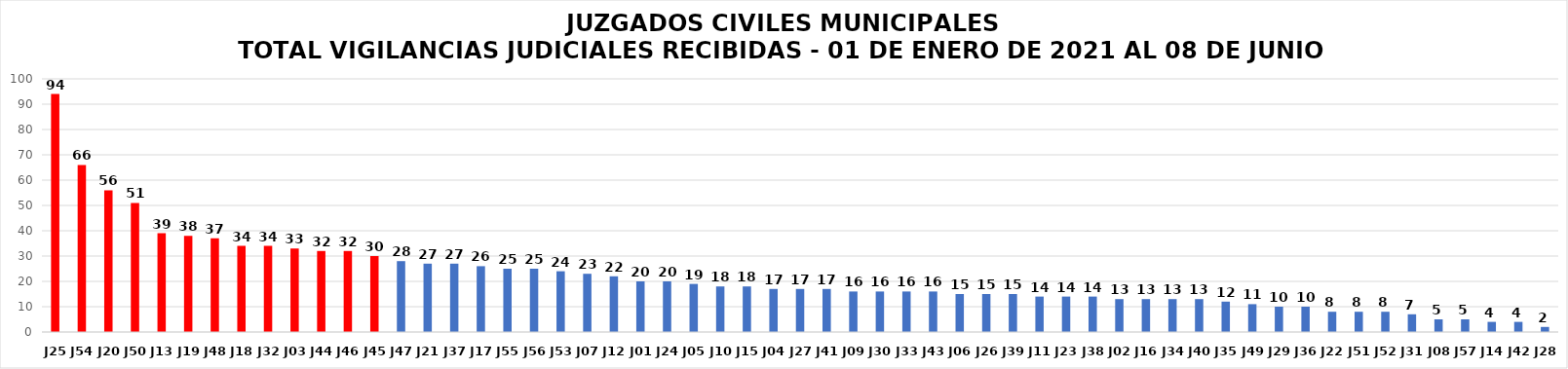
| Category | # VIGILANCIAS |
|---|---|
| J25 | 94 |
| J54 | 66 |
| J20 | 56 |
| J50 | 51 |
| J13 | 39 |
| J19 | 38 |
| J48 | 37 |
| J18 | 34 |
| J32 | 34 |
| J03 | 33 |
| J44 | 32 |
| J46 | 32 |
| J45 | 30 |
| J47 | 28 |
| J21 | 27 |
| J37 | 27 |
| J17 | 26 |
| J55 | 25 |
| J56 | 25 |
| J53 | 24 |
| J07 | 23 |
| J12 | 22 |
| J01 | 20 |
| J24 | 20 |
| J05 | 19 |
| J10 | 18 |
| J15 | 18 |
| J04 | 17 |
| J27 | 17 |
| J41 | 17 |
| J09 | 16 |
| J30 | 16 |
| J33 | 16 |
| J43 | 16 |
| J06 | 15 |
| J26 | 15 |
| J39 | 15 |
| J11 | 14 |
| J23 | 14 |
| J38 | 14 |
| J02 | 13 |
| J16 | 13 |
| J34 | 13 |
| J40 | 13 |
| J35 | 12 |
| J49 | 11 |
| J29 | 10 |
| J36 | 10 |
| J22 | 8 |
| J51 | 8 |
| J52 | 8 |
| J31 | 7 |
| J08 | 5 |
| J57 | 5 |
| J14 | 4 |
| J42 | 4 |
| J28 | 2 |